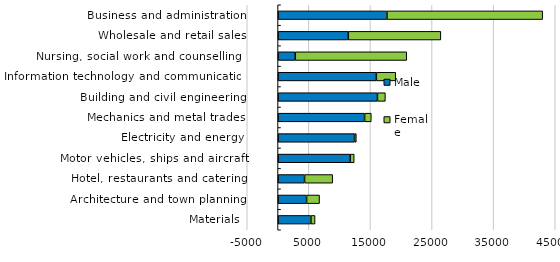
| Category | Male  | Female |
|---|---|---|
| Materials | 5335 | 671 |
| Architecture and town planning | 4636 | 2101 |
| Hotel, restaurants and catering | 4305 | 4564 |
| Motor vehicles, ships and aircraft | 11714 | 651 |
| Electricity and energy | 12420 | 286 |
| Mechanics and metal trades | 14051 | 1084 |
| Building and civil engineering | 16138 | 1287 |
| Information technology and communication | 15956 | 3150 |
| Nursing, social work and counselling   | 2799 | 18090 |
| Wholesale and retail sales | 11405 | 15025 |
| Business and administration | 17684 | 25276 |